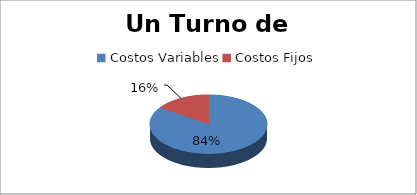
| Category | Series 0 |
|---|---|
| 0 | 47559650.338 |
| 1 | 8736700 |